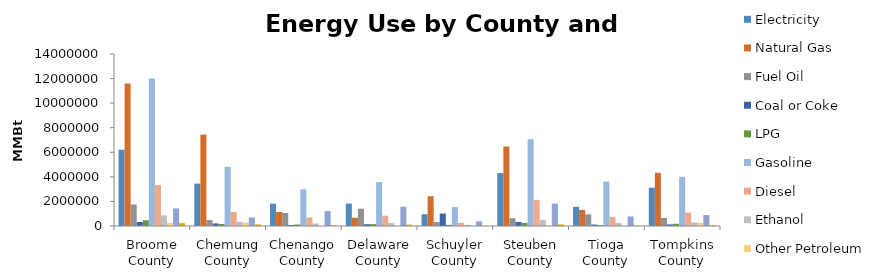
| Category | Electricity | Natural Gas | Fuel Oil | Coal or Coke | LPG | Gasoline | Diesel | Ethanol | Other Petroleum | Renewable | Other/Not specified |
|---|---|---|---|---|---|---|---|---|---|---|---|
| Broome County | 6210718.249 | 11603969.666 | 1749255.679 | 327287.728 | 464651.31 | 12001142.101 | 3330839.981 | 866392.539 | 259400.398 | 1435913.215 | 234662.286 |
| Chemung County | 3451963.959 | 7433784.383 | 491236.548 | 209027.496 | 166020.978 | 4810147.704 | 1135052.81 | 340626.046 | 270298.696 | 688273.556 | 134116.881 |
| Chenango County | 1823034.277 | 1139743.375 | 1057851.528 | 83419.721 | 126768.601 | 2994073.063 | 695004.093 | 208689.584 | 0 | 1220852.03 | 52586.156 |
| Delaware County | 1824796.359 | 675379.521 | 1405321.408 | 144971.836 | 154006.557 | 3569810.536 | 840037.822 | 240290.686 | 0 | 1565268.725 | 108172.405 |
| Schuyler County | 959323.518 | 2422504.092 | 327519.952 | 1017712.423 | 91252.895 | 1541511.77 | 247829.697 | 88942.789 | 0 | 382739.238 | 15835.003 |
| Steuben County | 4307972.569 | 6467047.678 | 634464.207 | 329105.923 | 249066.62 | 7068175.894 | 2110262.698 | 505538.674 | 0 | 1825126.444 | 130313.944 |
| Tioga County | 1560184.112 | 1312289.883 | 950352.139 | 114900.766 | 72706.691 | 3617379.871 | 747825.506 | 254309.173 | 0 | 778961.012 | 35916.619 |
| Tompkins County | 3115383.41 | 4326174.816 | 658651.704 | 131322.981 | 184723.72 | 4005718.725 | 1090235.96 | 279294.204 | 258470.079 | 889388.633 | 66593.637 |